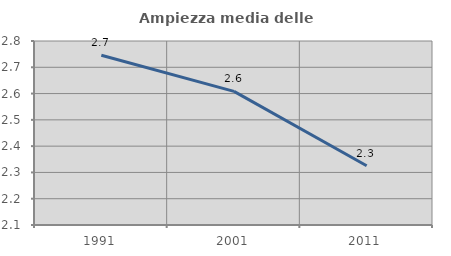
| Category | Ampiezza media delle famiglie |
|---|---|
| 1991.0 | 2.746 |
| 2001.0 | 2.608 |
| 2011.0 | 2.325 |